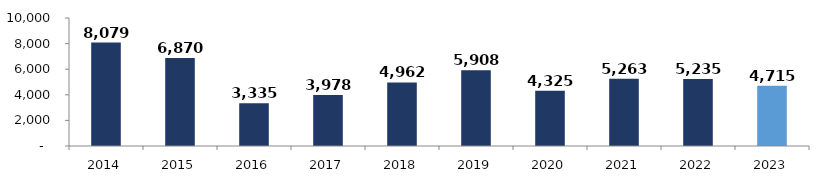
| Category | Series 0 |
|---|---|
| 2014.0 | 8079.21 |
| 2015.0 | 6869.666 |
| 2016.0 | 3334.835 |
| 2017.0 | 3978.376 |
| 2018.0 | 4961.841 |
| 2019.0 | 5908.495 |
| 2020.0 | 4325.381 |
| 2021.0 | 5263.28 |
| 2022.0 | 5234.59 |
| 2023.0 | 4715.349 |